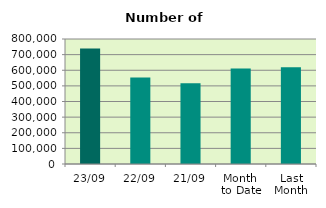
| Category | Series 0 |
|---|---|
| 23/09 | 739182 |
| 22/09 | 554052 |
| 21/09 | 516332 |
| Month 
to Date | 611777.765 |
| Last
Month | 618945.565 |